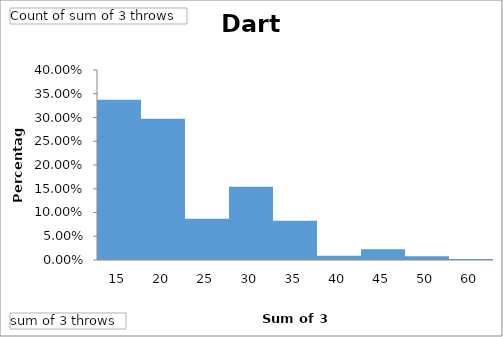
| Category | Total |
|---|---|
| 15 | 0.337 |
| 20 | 0.298 |
| 25 | 0.087 |
| 30 | 0.154 |
| 35 | 0.082 |
| 40 | 0.009 |
| 45 | 0.023 |
| 50 | 0.008 |
| 60 | 0.002 |